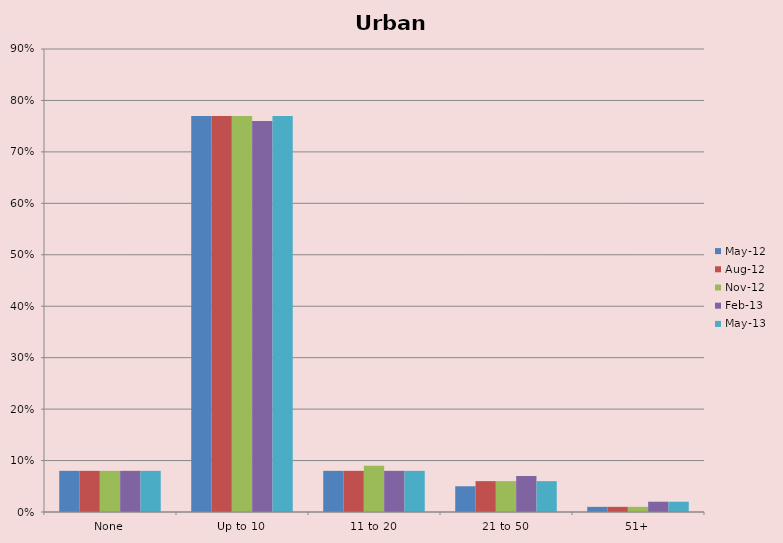
| Category | May-12 | Aug-12 | Nov-12 | Feb-13 | May-13 |
|---|---|---|---|---|---|
| None | 0.08 | 0.08 | 0.08 | 0.08 | 0.08 |
| Up to 10 | 0.77 | 0.77 | 0.77 | 0.76 | 0.77 |
| 11 to 20 | 0.08 | 0.08 | 0.09 | 0.08 | 0.08 |
| 21 to 50 | 0.05 | 0.06 | 0.06 | 0.07 | 0.06 |
| 51+ | 0.01 | 0.01 | 0.01 | 0.02 | 0.02 |